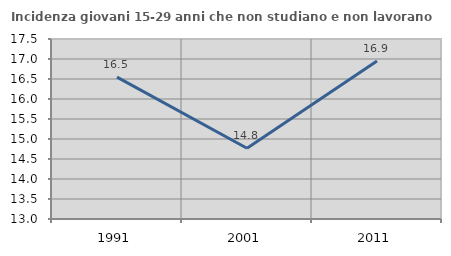
| Category | Incidenza giovani 15-29 anni che non studiano e non lavorano  |
|---|---|
| 1991.0 | 16.548 |
| 2001.0 | 14.768 |
| 2011.0 | 16.949 |